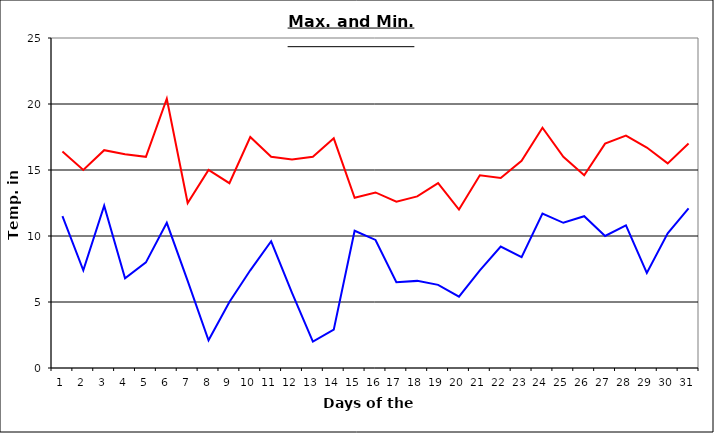
| Category | Series 0 | Series 1 |
|---|---|---|
| 0 | 16.4 | 11.5 |
| 1 | 15 | 7.4 |
| 2 | 16.5 | 12.3 |
| 3 | 16.2 | 6.8 |
| 4 | 16 | 8 |
| 5 | 20.4 | 11 |
| 6 | 12.5 | 6.6 |
| 7 | 15 | 2.1 |
| 8 | 14 | 5 |
| 9 | 17.5 | 7.4 |
| 10 | 16 | 9.6 |
| 11 | 15.8 | 5.7 |
| 12 | 16 | 2 |
| 13 | 17.4 | 2.9 |
| 14 | 12.9 | 10.4 |
| 15 | 13.3 | 9.7 |
| 16 | 12.6 | 6.5 |
| 17 | 13 | 6.6 |
| 18 | 14 | 6.3 |
| 19 | 12 | 5.4 |
| 20 | 14.6 | 7.4 |
| 21 | 14.4 | 9.2 |
| 22 | 15.7 | 8.4 |
| 23 | 18.2 | 11.7 |
| 24 | 16 | 11 |
| 25 | 14.6 | 11.5 |
| 26 | 17 | 10 |
| 27 | 17.6 | 10.8 |
| 28 | 16.7 | 7.2 |
| 29 | 15.5 | 10.2 |
| 30 | 17 | 12.1 |